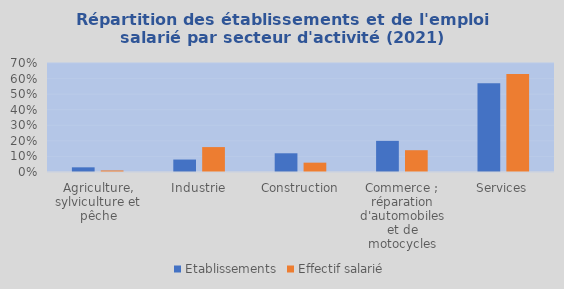
| Category | Etablissements | Effectif salarié |
|---|---|---|
| Agriculture, sylviculture et pêche | 0.03 | 0.01 |
| Industrie | 0.08 | 0.16 |
| Construction | 0.12 | 0.06 |
| Commerce ; réparation d'automobiles et de motocycles | 0.2 | 0.14 |
| Services | 0.57 | 0.63 |